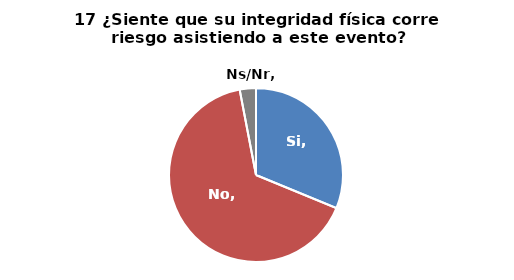
| Category | Series 0 |
|---|---|
| Si | 0.312 |
| No | 0.658 |
| Ns/Nr | 0.03 |